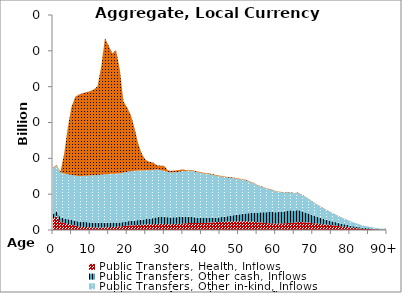
| Category | Public Transfers, Health, Inflows | Public Transfers, Other cash, Inflows | Public Transfers, Other in-kind, Inflows | Public Transfers, Education, Inflows |
|---|---|---|---|---|
| 0 | 1.584 | 0.623 | 6.444 | 0.101 |
|  | 1.99 | 0.625 | 6.357 | 0.099 |
| 2 | 1.11 | 0.629 | 6.301 | 0.098 |
| 3 | 0.984 | 0.636 | 6.272 | 2.701 |
| 4 | 0.862 | 0.646 | 6.266 | 6.568 |
| 5 | 0.743 | 0.657 | 6.282 | 9.528 |
| 6 | 0.624 | 0.651 | 6.315 | 10.987 |
| 7 | 0.484 | 0.682 | 6.361 | 11.389 |
| 8 | 0.436 | 0.694 | 6.418 | 11.54 |
| 9 | 0.41 | 0.687 | 6.483 | 11.667 |
| 10 | 0.373 | 0.672 | 6.555 | 11.769 |
| 11 | 0.369 | 0.673 | 6.636 | 11.932 |
| 12 | 0.359 | 0.625 | 6.703 | 12.363 |
| 13 | 0.355 | 0.628 | 6.743 | 15.096 |
| 14 | 0.369 | 0.627 | 6.767 | 19.024 |
| 15 | 0.406 | 0.624 | 6.791 | 17.902 |
| 16 | 0.433 | 0.6 | 6.811 | 16.782 |
| 17 | 0.463 | 0.567 | 6.834 | 17.246 |
| 18 | 0.49 | 0.56 | 6.865 | 14.466 |
| 19 | 0.543 | 0.566 | 6.898 | 9.911 |
| 20 | 0.618 | 0.587 | 6.923 | 8.968 |
| 21 | 0.652 | 0.63 | 6.943 | 7.8 |
| 22 | 0.653 | 0.655 | 6.945 | 5.905 |
| 23 | 0.719 | 0.665 | 6.922 | 3.654 |
| 24 | 0.738 | 0.67 | 6.88 | 2.264 |
| 25 | 0.784 | 0.73 | 6.839 | 1.422 |
| 26 | 0.787 | 0.758 | 6.799 | 1.164 |
| 27 | 0.817 | 0.845 | 6.738 | 1.019 |
| 28 | 0.858 | 0.929 | 6.649 | 0.592 |
| 29 | 0.868 | 0.952 | 6.545 | 0.617 |
| 30 | 0.854 | 0.959 | 6.441 | 0.69 |
| 31 | 0.811 | 0.974 | 6.326 | 0.186 |
| 32 | 0.814 | 0.93 | 6.26 | 0.268 |
| 33 | 0.859 | 0.929 | 6.269 | 0.25 |
| 34 | 0.847 | 0.957 | 6.325 | 0.254 |
| 35 | 0.918 | 0.938 | 6.369 | 0.229 |
| 36 | 0.943 | 0.894 | 6.413 | 0.1 |
| 37 | 0.989 | 0.859 | 6.43 | 0.1 |
| 38 | 0.977 | 0.803 | 6.402 | 0.1 |
| 39 | 0.971 | 0.743 | 6.34 | 0.099 |
| 40 | 0.971 | 0.694 | 6.277 | 0.098 |
| 41 | 1.007 | 0.656 | 6.21 | 0.097 |
| 42 | 1.054 | 0.641 | 6.121 | 0.096 |
| 43 | 1.062 | 0.618 | 6.005 | 0.094 |
| 44 | 1.114 | 0.597 | 5.868 | 0.092 |
| 45 | 1.129 | 0.643 | 5.721 | 0.089 |
| 46 | 1.14 | 0.709 | 5.56 | 0.087 |
| 47 | 1.172 | 0.739 | 5.401 | 0.084 |
| 48 | 1.174 | 0.837 | 5.251 | 0.082 |
| 49 | 1.192 | 0.904 | 5.103 | 0.08 |
| 50 | 1.211 | 0.943 | 4.948 | 0.077 |
| 51 | 1.225 | 1.029 | 4.794 | 0.075 |
| 52 | 1.232 | 1.087 | 4.608 | 0.072 |
| 53 | 1.187 | 1.165 | 4.379 | 0.068 |
| 54 | 1.166 | 1.249 | 4.123 | 0.064 |
| 55 | 1.092 | 1.282 | 3.873 | 0.06 |
| 56 | 1.046 | 1.421 | 3.622 | 0.057 |
| 57 | 0.991 | 1.487 | 3.4 | 0.053 |
| 58 | 0.946 | 1.553 | 3.224 | 0.05 |
| 59 | 0.923 | 1.595 | 3.08 | 0.048 |
| 60 | 0.91 | 1.549 | 2.936 | 0.046 |
| 61 | 0.905 | 1.62 | 2.791 | 0.044 |
| 62 | 0.959 | 1.601 | 2.671 | 0.042 |
| 63 | 0.958 | 1.705 | 2.583 | 0.04 |
| 64 | 1.02 | 1.74 | 2.514 | 0.039 |
| 65 | 1.027 | 1.649 | 2.448 | 0.038 |
| 66 | 1.107 | 1.696 | 2.391 | 0.037 |
| 67 | 1.101 | 1.525 | 2.309 | 0.036 |
| 68 | 1.059 | 1.374 | 2.184 | 0.034 |
| 69 | 1.044 | 1.239 | 2.032 | 0.032 |
| 70 | 0.955 | 1.074 | 1.886 | 0.029 |
| 71 | 0.904 | 0.968 | 1.741 | 0.027 |
| 72 | 0.887 | 0.826 | 1.6 | 0.025 |
| 73 | 0.79 | 0.739 | 1.468 | 0.023 |
| 74 | 0.745 | 0.633 | 1.344 | 0.021 |
| 75 | 0.689 | 0.533 | 1.22 | 0.019 |
| 76 | 0.621 | 0.488 | 1.097 | 0.017 |
| 77 | 0.552 | 0.406 | 0.977 | 0.015 |
| 78 | 0.481 | 0.356 | 0.859 | 0.013 |
| 79 | 0.431 | 0.316 | 0.744 | 0.012 |
| 80 | 0.358 | 0.258 | 0.637 | 0.01 |
| 81 | 0.302 | 0.218 | 0.537 | 0.008 |
| 82 | 0.25 | 0.181 | 0.445 | 0.007 |
| 83 | 0.204 | 0.147 | 0.362 | 0.006 |
| 84 | 0.163 | 0.117 | 0.289 | 0.005 |
| 85 | 0.137 | 0.099 | 0.243 | 0.004 |
| 86 | 0.108 | 0.078 | 0.192 | 0.003 |
| 87 | 0.084 | 0.06 | 0.149 | 0.002 |
| 88 | 0.063 | 0.045 | 0.112 | 0.002 |
| 89 | 0.046 | 0.033 | 0.082 | 0.001 |
| 90+ | 0.095 | 0.068 | 0.168 | 0.003 |